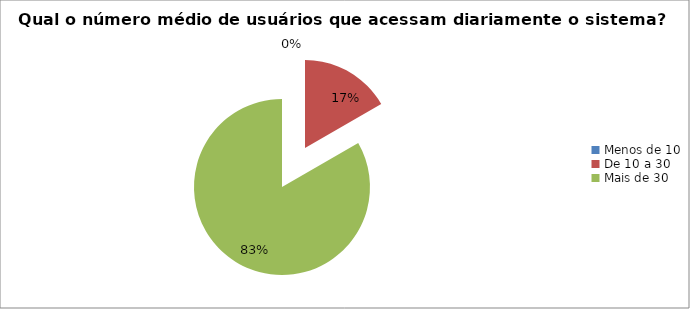
| Category | Series 0 |
|---|---|
| Menos de 10 | 0 |
| De 10 a 30 | 0.167 |
| Mais de 30 | 0.833 |